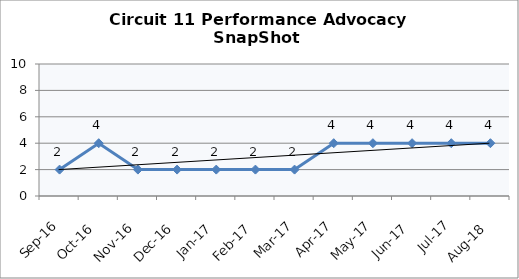
| Category | Circuit 11 |
|---|---|
| Sep-16 | 2 |
| Oct-16 | 4 |
| Nov-16 | 2 |
| Dec-16 | 2 |
| Jan-17 | 2 |
| Feb-17 | 2 |
| Mar-17 | 2 |
| Apr-17 | 4 |
| May-17 | 4 |
| Jun-17 | 4 |
| Jul-17 | 4 |
| Aug-18 | 4 |